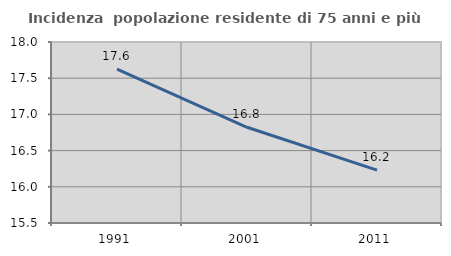
| Category | Incidenza  popolazione residente di 75 anni e più |
|---|---|
| 1991.0 | 17.625 |
| 2001.0 | 16.822 |
| 2011.0 | 16.23 |